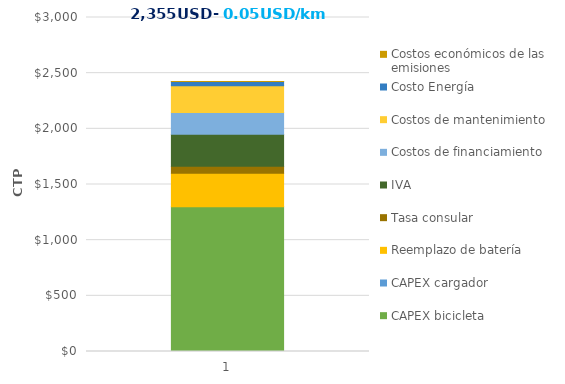
| Category | CAPEX bicicleta | CAPEX cargador | Reemplazo de batería | Tasa consular | IVA | Costos de financiamiento | Costos de mantenimiento | Costo Energía | Costos económicos de las emisiones |
|---|---|---|---|---|---|---|---|---|---|
| 0 | 1300 | 0 | 300 | 65 | 286 | 196.826 | 240 | 37.128 | 0.53 |